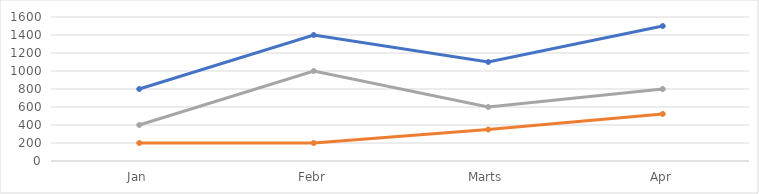
| Category | Daina | Dāvis | Braiens |
|---|---|---|---|
| Jan | 800 | 200 | 400 |
| Febr | 1400 | 200 | 1000 |
| Marts | 1100 | 350 | 600 |
| Apr | 1500 | 523 | 800 |